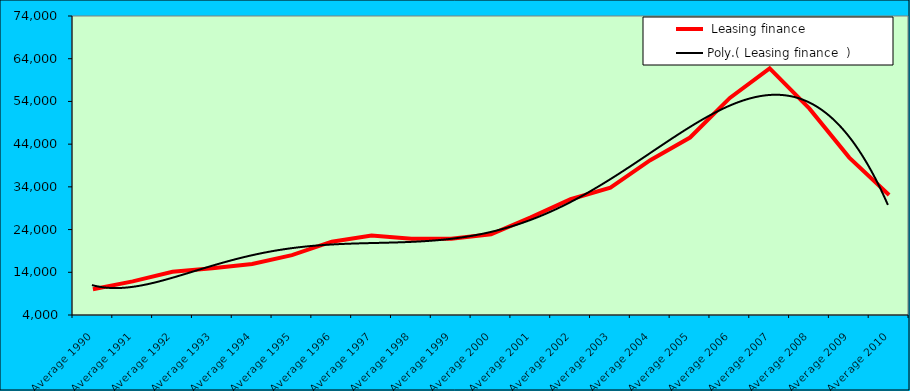
| Category |  Leasing finance   |
|---|---|
| Average 1990 | 10041.25 |
| Average 1991 | 11864.167 |
| Average 1992 | 14102.917 |
| Average 1993 | 14963.417 |
| Average 1994 | 15962.75 |
| Average 1995 | 18006.5 |
| Average 1996 | 21168.583 |
| Average 1997 | 22602 |
| Average 1998 | 21876.917 |
| Average 1999 | 21836.182 |
| Average 2000 | 22905 |
| Average 2001 | 26862.364 |
| Average 2002 | 31100.833 |
| Average 2003 | 33815.25 |
| Average 2004 | 40236.667 |
| Average 2005 | 45549.583 |
| Average 2006 | 54815.083 |
| Average 2007 | 61720.917 |
| Average 2008 | 52315 |
| Average 2009 | 40846.667 |
| Average 2010 | 32092.875 |